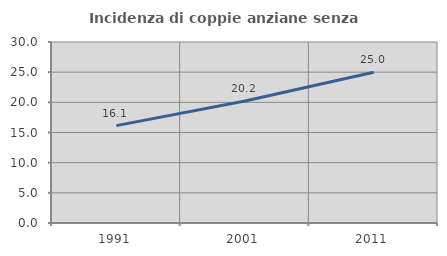
| Category | Incidenza di coppie anziane senza figli  |
|---|---|
| 1991.0 | 16.143 |
| 2001.0 | 20.213 |
| 2011.0 | 25 |